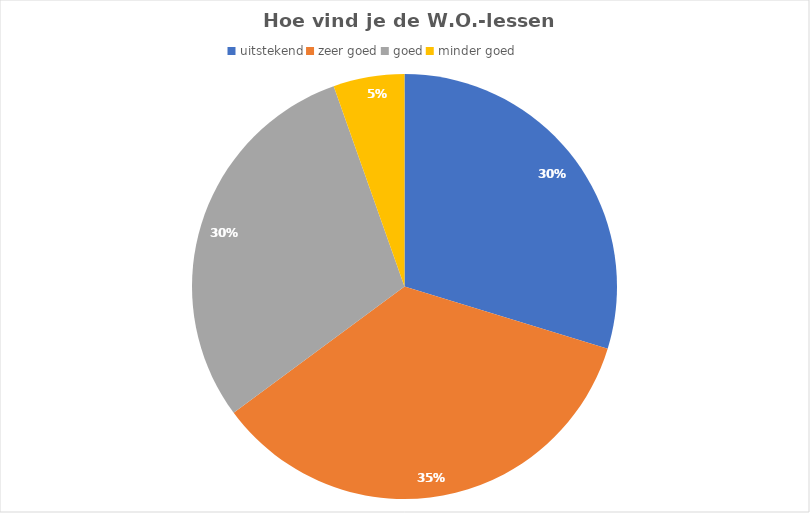
| Category | Series 0 |
|---|---|
| uitstekend | 11 |
| zeer goed | 13 |
| goed | 11 |
| minder goed | 2 |
| slecht | 0 |